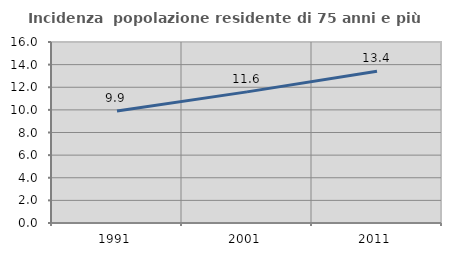
| Category | Incidenza  popolazione residente di 75 anni e più |
|---|---|
| 1991.0 | 9.902 |
| 2001.0 | 11.592 |
| 2011.0 | 13.42 |